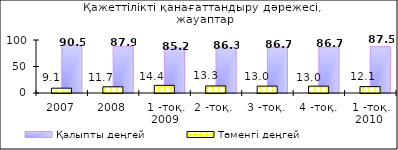
| Category | білмеймін | Қалыпты деңгей |
|---|---|---|
| 2007 | 0.5 | 90.46 |
| 2008 | 0.387 | 87.885 |
| 1 -тоқ. 2009 | 0.41 | 85.18 |
| 2 -тоқ.  | 0.33 | 86.33 |
| 3 -тоқ. | 0.32 | 86.65 |
| 4 -тоқ. | 0.4 | 86.65 |
| 1 -тоқ. 2010  | 0.44 | 87.49 |